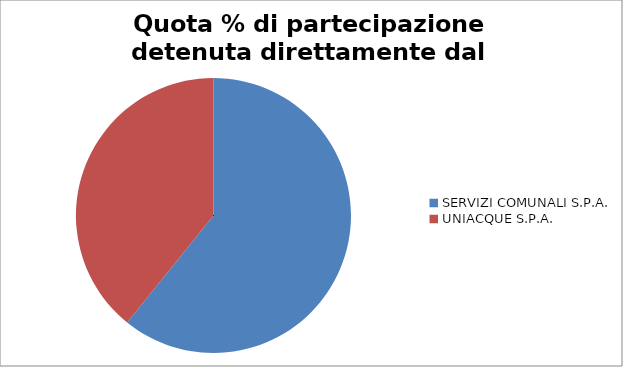
| Category | Quota % di partecipazione detenuta direttamente dal Comune di Bagnatica |
|---|---|
| SERVIZI COMUNALI S.P.A. | 0.543 |
| UNIACQUE S.P.A. | 0.35 |